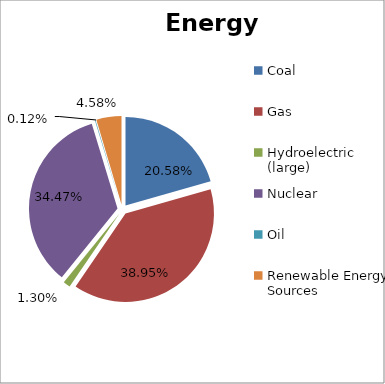
| Category | Energy Source |
|---|---|
| Coal | 0.206 |
| Gas | 0.39 |
| Hydroelectric (large) | 0.013 |
| Nuclear | 0.345 |
| Oil | 0.001 |
| Renewable Energy Sources | 0.046 |